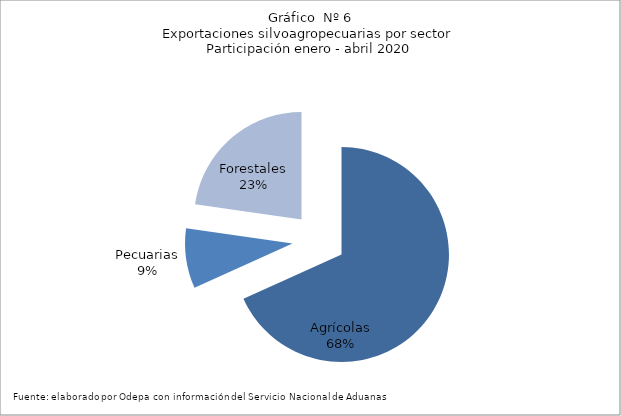
| Category | Series 0 |
|---|---|
| Agrícolas | 3992319 |
| Pecuarias | 526962 |
| Forestales | 1329197 |